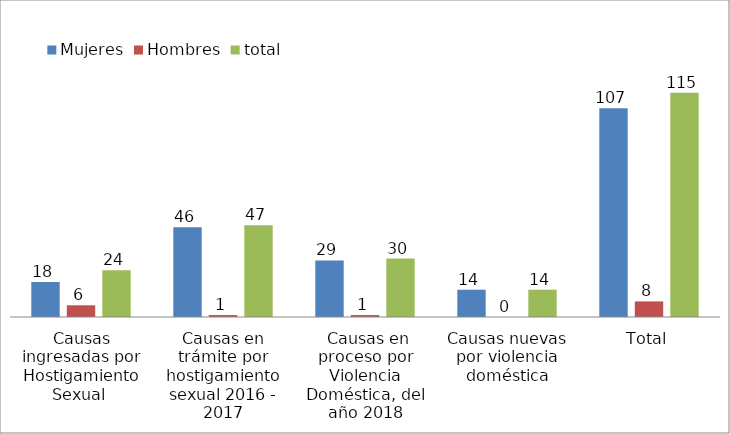
| Category | Mujeres | Hombres | total |
|---|---|---|---|
| Causas ingresadas por Hostigamiento Sexual  | 18 | 6 | 24 |
| Causas en trámite por hostigamiento sexual 2016 - 2017 | 46 | 1 | 47 |
|  Causas en proceso por Violencia Doméstica, del año 2018 | 29 | 1 | 30 |
| Causas nuevas por violencia doméstica | 14 | 0 | 14 |
| Total | 107 | 8 | 115 |